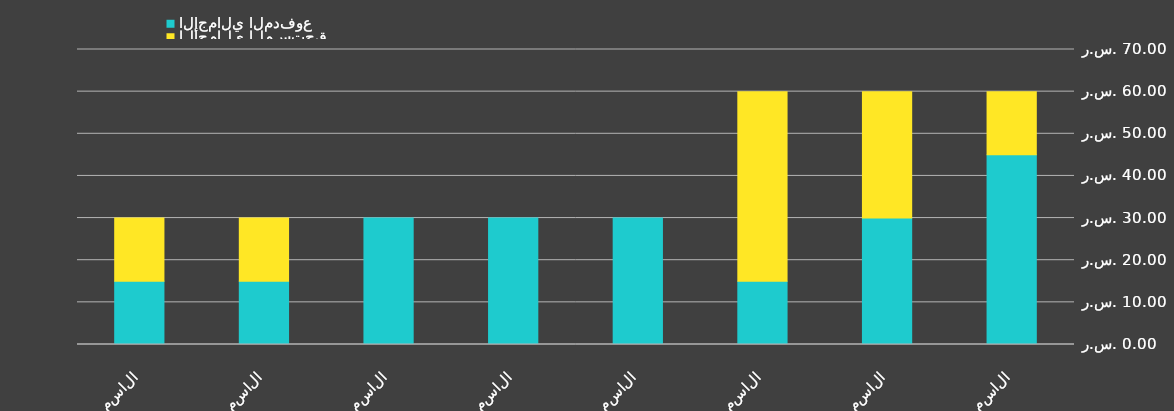
| Category | الإجمالي المدفوع | الإجمالي المستحق |
|---|---|---|
| الاسم 1 | 45 | 15 |
| الاسم 2 | 30 | 30 |
| الاسم 3 | 15 | 45 |
| الاسم 4 | 30 | 0 |
| الاسم 5 | 30 | 0 |
| الاسم 6 | 30 | 0 |
| الاسم 7 | 15 | 15 |
| الاسم 8 | 15 | 15 |